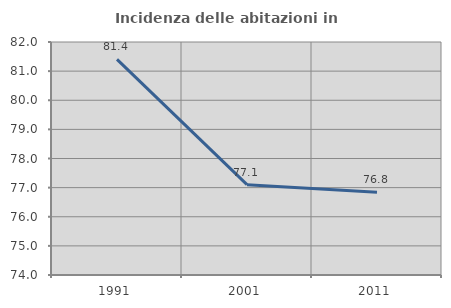
| Category | Incidenza delle abitazioni in proprietà  |
|---|---|
| 1991.0 | 81.402 |
| 2001.0 | 77.102 |
| 2011.0 | 76.845 |